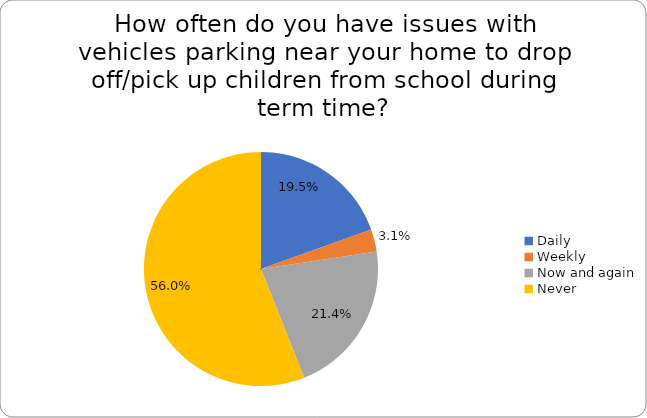
| Category | Series 0 |
|---|---|
| Daily | 0.195 |
| Weekly | 0.031 |
| Now and again | 0.214 |
| Never | 0.56 |